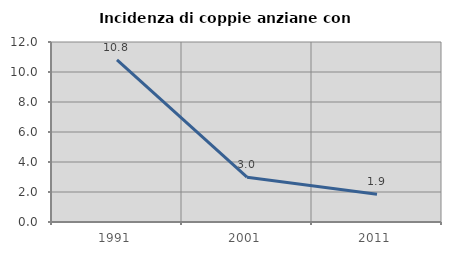
| Category | Incidenza di coppie anziane con figli |
|---|---|
| 1991.0 | 10.811 |
| 2001.0 | 2.985 |
| 2011.0 | 1.852 |